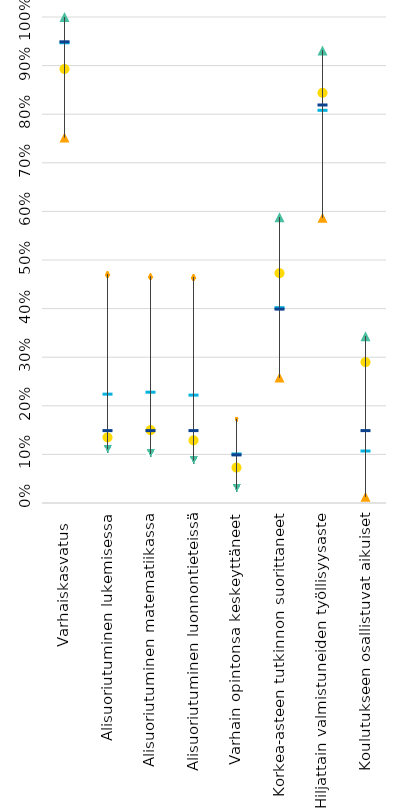
| Category | Finland | Strongest performer | Weakest performer | EU average | EU target |
|---|---|---|---|---|---|
| Varhaiskasvatus  | 0.893 | 1 | 0.752 | 0.948 | 0.95 |
| Alisuoriutuminen lukemisessa | 0.135 | 0.111 | 0.471 | 0.225 | 0.15 |
| Alisuoriutuminen matematiikassa | 0.15 | 0.102 | 0.466 | 0.229 | 0.15 |
| Alisuoriutuminen luonnontieteissä | 0.129 | 0.088 | 0.465 | 0.223 | 0.15 |
| Varhain opintonsa keskeyttäneet | 0.073 | 0.03 | 0.173 | 0.102 | 0.1 |
| Korkea-asteen tutkinnon suorittaneet | 0.473 | 0.588 | 0.258 | 0.403 | 0.4 |
| Hiljattain valmistuneiden työllisyysaste | 0.844 | 0.931 | 0.587 | 0.809 | 0.82 |
| Koulutukseen osallistuvat aikuiset | 0.29 | 0.343 | 0.013 | 0.108 | 0.15 |